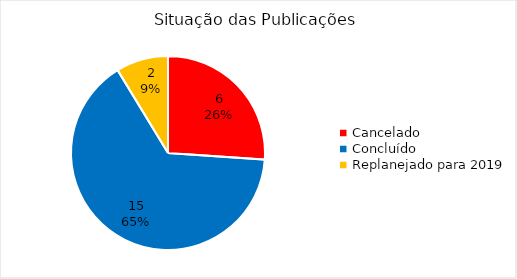
| Category | Total |
|---|---|
| Cancelado | 6 |
| Concluído | 15 |
| Replanejado para 2019 | 2 |